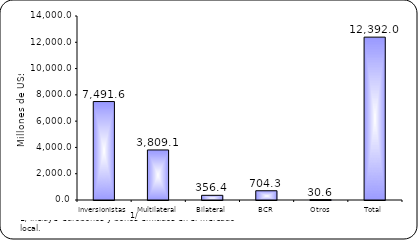
| Category | Series 1 |
|---|---|
| Inversionistas | 7491.6 |
| Multilateral | 3809.1 |
| Bilateral | 356.4 |
| BCR | 704.3 |
| Otros | 30.6 |
| Total | 12392 |